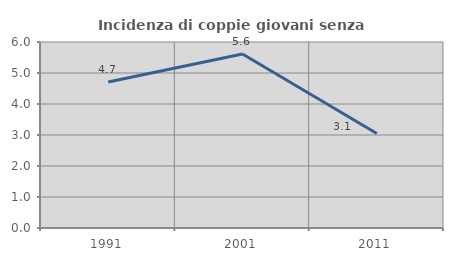
| Category | Incidenza di coppie giovani senza figli |
|---|---|
| 1991.0 | 4.709 |
| 2001.0 | 5.616 |
| 2011.0 | 3.05 |